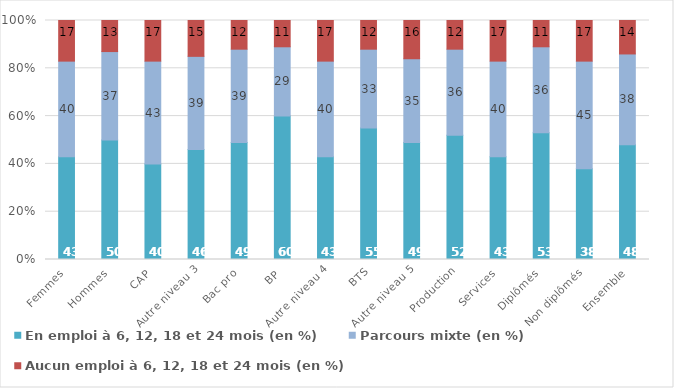
| Category | En emploi à 6, 12, 18 et 24 mois (en %) | Parcours mixte (en %) | Aucun emploi à 6, 12, 18 et 24 mois (en %) |
|---|---|---|---|
| Femmes | 43 | 40 | 17 |
| Hommes | 50 | 37 | 13 |
| CAP | 40 | 43 | 17 |
| Autre niveau 3 | 46 | 39 | 15 |
| Bac pro | 49 | 39 | 12 |
| BP | 60 | 29 | 11 |
| Autre niveau 4 | 43 | 40 | 17 |
| BTS | 55 | 33 | 12 |
| Autre niveau 5 | 49 | 35 | 16 |
| Production | 52 | 36 | 12 |
| Services | 43 | 40 | 17 |
| Diplômés | 53 | 36 | 11 |
| Non diplômés | 38 | 45 | 17 |
| Ensemble | 48 | 38 | 14 |